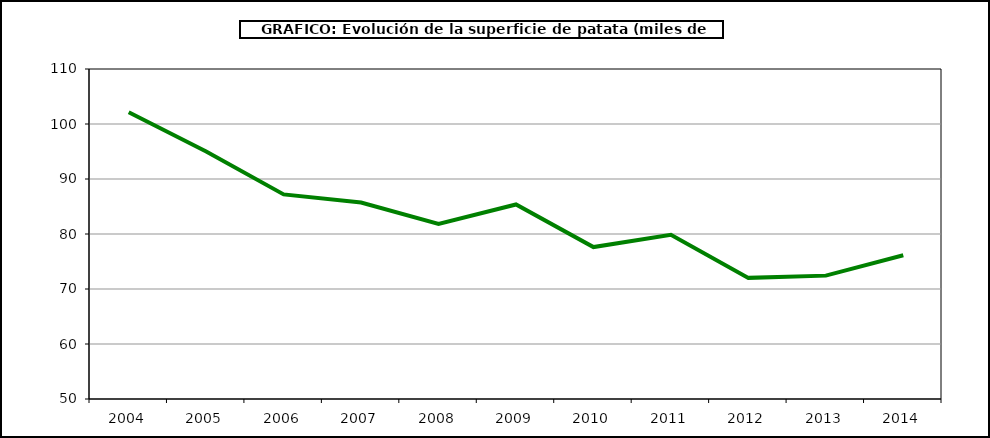
| Category | Superficie |
|---|---|
| 2004.0 | 102.12 |
| 2005.0 | 94.998 |
| 2006.0 | 87.199 |
| 2007.0 | 85.728 |
| 2008.0 | 81.825 |
| 2009.0 | 85.366 |
| 2010.0 | 77.622 |
| 2011.0 | 79.865 |
| 2012.0 | 72.023 |
| 2013.0 | 72.431 |
| 2014.0 | 76.129 |